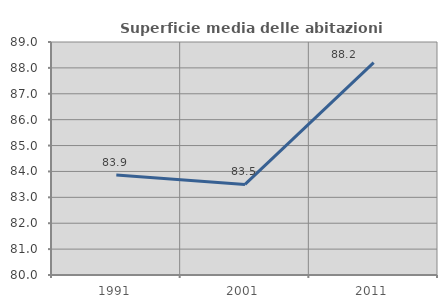
| Category | Superficie media delle abitazioni occupate |
|---|---|
| 1991.0 | 83.861 |
| 2001.0 | 83.499 |
| 2011.0 | 88.207 |